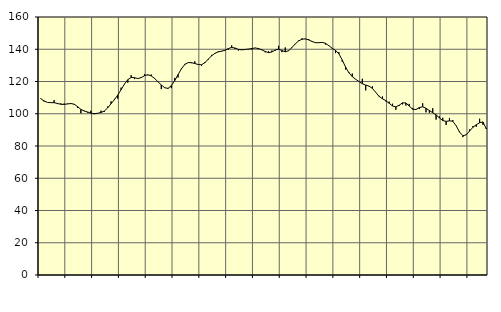
| Category | Piggar | Series 1 |
|---|---|---|
| nan | 109.6 | 109.36 |
| 87.0 | 107.6 | 107.99 |
| 87.0 | 107 | 107.05 |
| 87.0 | 107 | 106.88 |
| nan | 108.4 | 106.86 |
| 88.0 | 106 | 106.39 |
| 88.0 | 106.4 | 105.88 |
| 88.0 | 106.3 | 105.81 |
| nan | 106.3 | 106.06 |
| 89.0 | 106.6 | 106.34 |
| 89.0 | 105.6 | 105.93 |
| 89.0 | 103.6 | 104.45 |
| nan | 100.3 | 102.7 |
| 90.0 | 101.9 | 101.67 |
| 90.0 | 100.7 | 101.09 |
| 90.0 | 101.9 | 100.37 |
| nan | 99.7 | 100.04 |
| 91.0 | 100.2 | 100.3 |
| 91.0 | 101.9 | 100.79 |
| 91.0 | 101.2 | 101.69 |
| nan | 104.5 | 103.66 |
| 92.0 | 107.7 | 106.22 |
| 92.0 | 109.2 | 108.7 |
| 92.0 | 109.4 | 111.6 |
| nan | 116.2 | 114.93 |
| 93.0 | 118.5 | 118.37 |
| 93.0 | 119.3 | 121.13 |
| 93.0 | 123.9 | 122.52 |
| nan | 121.5 | 122.36 |
| 94.0 | 121.9 | 121.84 |
| 94.0 | 122.8 | 122.42 |
| 94.0 | 124.6 | 123.65 |
| nan | 123.9 | 124.18 |
| 95.0 | 124.3 | 123.46 |
| 95.0 | 122.1 | 121.9 |
| 95.0 | 120.1 | 119.84 |
| nan | 115.3 | 117.86 |
| 96.0 | 116.3 | 116.16 |
| 96.0 | 115.4 | 115.72 |
| 96.0 | 115.9 | 117.42 |
| nan | 122.2 | 120.57 |
| 97.0 | 122.5 | 124.3 |
| 97.0 | 128.2 | 127.85 |
| 97.0 | 130.9 | 130.55 |
| nan | 131.7 | 131.74 |
| 98.0 | 131.4 | 131.66 |
| 98.0 | 132.5 | 131.15 |
| 98.0 | 130.6 | 130.54 |
| nan | 129.8 | 130.38 |
| 99.0 | 132.1 | 131.62 |
| 99.0 | 133.5 | 133.83 |
| 99.0 | 136.5 | 135.92 |
| nan | 137.2 | 137.48 |
| 0.0 | 138.7 | 138.39 |
| 0.0 | 138.6 | 138.81 |
| 0.0 | 139.5 | 139.37 |
| nan | 139.8 | 140.42 |
| 1.0 | 142.4 | 141.12 |
| 1.0 | 140.2 | 140.77 |
| 1.0 | 139.2 | 139.95 |
| nan | 140 | 139.63 |
| 2.0 | 139.8 | 139.86 |
| 2.0 | 139.9 | 140.11 |
| 2.0 | 139.8 | 140.46 |
| nan | 140.9 | 140.78 |
| 3.0 | 140 | 140.46 |
| 3.0 | 140 | 139.64 |
| 3.0 | 138.1 | 138.61 |
| nan | 138.7 | 137.9 |
| 4.0 | 139.2 | 138.3 |
| 4.0 | 139.2 | 139.49 |
| 4.0 | 142.1 | 140.1 |
| nan | 138.2 | 139.23 |
| 5.0 | 141.1 | 138.39 |
| 5.0 | 139.3 | 139.11 |
| 5.0 | 141.3 | 141.09 |
| nan | 143.2 | 143.38 |
| 6.0 | 145.5 | 145.17 |
| 6.0 | 146.8 | 146.24 |
| 6.0 | 146.6 | 146.41 |
| nan | 146.3 | 145.78 |
| 7.0 | 144.6 | 144.82 |
| 7.0 | 143.9 | 144.08 |
| 7.0 | 144.2 | 144.05 |
| nan | 144 | 144.25 |
| 8.0 | 142.9 | 143.69 |
| 8.0 | 142 | 142.22 |
| 8.0 | 140.4 | 140.6 |
| nan | 137.6 | 139.29 |
| 9.0 | 138.2 | 137.16 |
| 9.0 | 132.3 | 133.35 |
| 9.0 | 127.4 | 128.92 |
| nan | 125.8 | 125.42 |
| 10.0 | 124.9 | 123.02 |
| 10.0 | 121.3 | 121.39 |
| 10.0 | 120 | 120 |
| nan | 121.7 | 118.62 |
| 11.0 | 114.5 | 117.77 |
| 11.0 | 117 | 117.14 |
| 11.0 | 117 | 115.72 |
| nan | 113.4 | 113.26 |
| 12.0 | 111.1 | 110.76 |
| 12.0 | 110.7 | 109.3 |
| 12.0 | 107.7 | 108.14 |
| nan | 107.5 | 106.5 |
| 13.0 | 106.2 | 104.83 |
| 13.0 | 102.4 | 104.26 |
| 13.0 | 104.8 | 105.29 |
| nan | 105.8 | 106.78 |
| 14.0 | 105.1 | 106.69 |
| 14.0 | 106.1 | 104.79 |
| 14.0 | 103.6 | 102.82 |
| nan | 102.4 | 102.6 |
| 15.0 | 102.9 | 103.86 |
| 15.0 | 106.5 | 104.3 |
| 15.0 | 100.9 | 103.38 |
| nan | 100.6 | 102 |
| 16.0 | 103.4 | 100.65 |
| 16.0 | 96.4 | 99.31 |
| 16.0 | 98.4 | 97.44 |
| nan | 97.5 | 95.77 |
| 17.0 | 93.1 | 95.27 |
| 17.0 | 97.4 | 95.6 |
| 17.0 | 96.1 | 95.32 |
| nan | 92.5 | 92.56 |
| 18.0 | 88.9 | 88.64 |
| 18.0 | 85.5 | 86.38 |
| 18.0 | 86.8 | 86.94 |
| nan | 90.3 | 89.27 |
| 19.0 | 92.4 | 91.6 |
| 19.0 | 91.9 | 93.21 |
| 19.0 | 96.9 | 94.4 |
| nan | 93.1 | 94.93 |
| 20.0 | 91.2 | 90.57 |